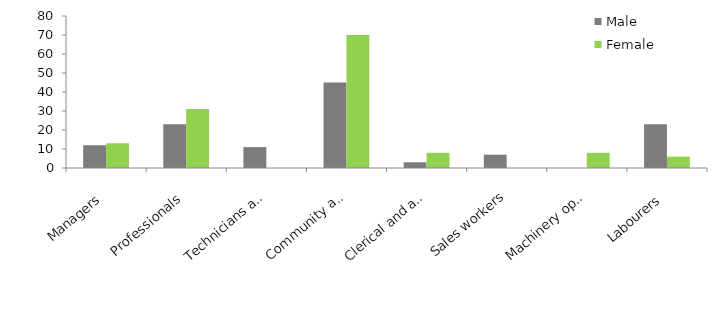
| Category | Male | Female |
|---|---|---|
| Managers | 12 | 13 |
| Professionals | 23 | 31 |
| Technicians and trades workers | 11 | 0 |
| Community and personal service workers | 45 | 70 |
| Clerical and administrative workers | 3 | 8 |
| Sales workers | 7 | 0 |
| Machinery operators and drivers | 0 | 8 |
| Labourers | 23 | 6 |